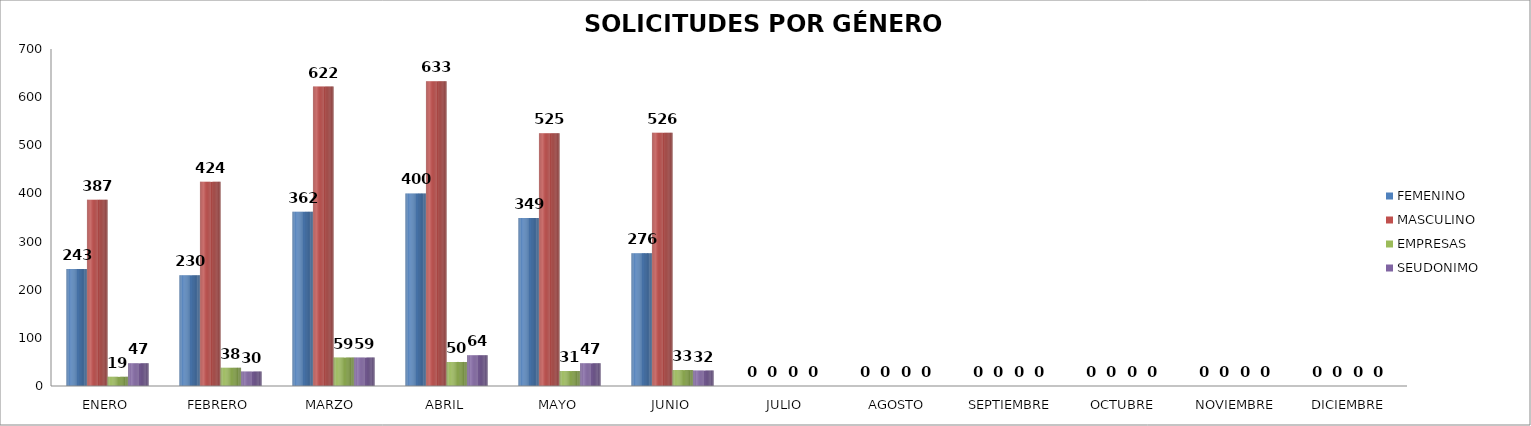
| Category | FEMENINO | MASCULINO | EMPRESAS | SEUDONIMO |
|---|---|---|---|---|
| ENERO | 243 | 387 | 19 | 47 |
| FEBRERO | 230 | 424 | 38 | 30 |
| MARZO  | 362 | 622 | 59 | 59 |
| ABRIL | 400 | 633 | 50 | 64 |
| MAYO | 349 | 525 | 31 | 47 |
| JUNIO | 276 | 526 | 33 | 32 |
| JULIO | 0 | 0 | 0 | 0 |
| AGOSTO | 0 | 0 | 0 | 0 |
| SEPTIEMBRE | 0 | 0 | 0 | 0 |
| OCTUBRE | 0 | 0 | 0 | 0 |
| NOVIEMBRE | 0 | 0 | 0 | 0 |
| DICIEMBRE | 0 | 0 | 0 | 0 |